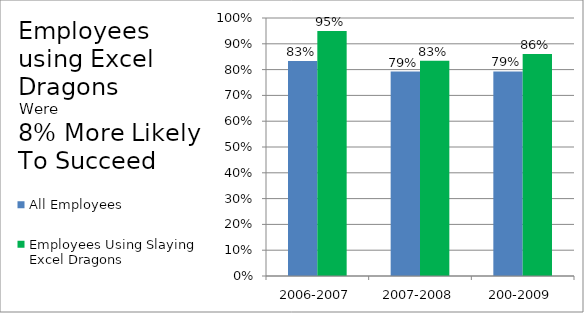
| Category | All Employees | Employees Using Slaying Excel Dragons |
|---|---|---|
| 2006-2007 | 0.834 | 0.95 |
| 2007-2008 | 0.792 | 0.834 |
| 200-2009 | 0.793 | 0.86 |